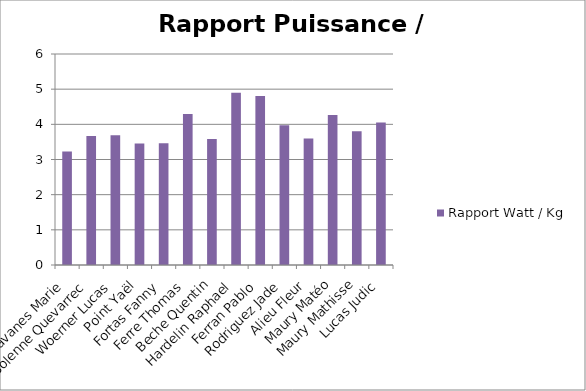
| Category | Rapport Watt / Kg |
|---|---|
| Chavanes Marie | 3.229 |
| Solenne Quevarrec | 3.671 |
| Woerner Lucas | 3.689 |
| Point Yaël | 3.452 |
| Fortas Fanny | 3.463 |
| Ferre Thomas | 4.297 |
| Beche Quentin | 3.583 |
| Hardelin Raphael | 4.897 |
| Ferran Pablo | 4.808 |
| Rodriguez Jade | 3.973 |
| Alieu Fleur | 3.596 |
| Maury Matéo | 4.264 |
| Maury Mathisse | 3.802 |
| Lucas Judic | 4.051 |